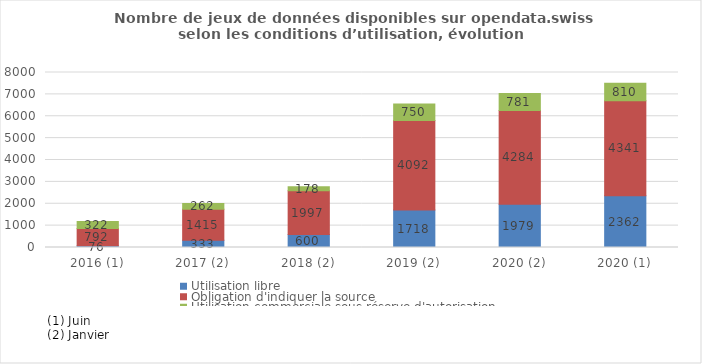
| Category | Utilisation libre | Obligation d'indiquer la source | Utilisation commerciale sous réserve d'autorisation |
|---|---|---|---|
| 2016 (1) | 76 | 792 | 322 |
| 2017 (2) | 333 | 1415 | 262 |
| 2018 (2) | 600 | 1997 | 178 |
| 2019 (2) | 1718 | 4092 | 750 |
| 2020 (2) | 1979 | 4284 | 781 |
| 2020 (1) | 2362 | 4341 | 810 |